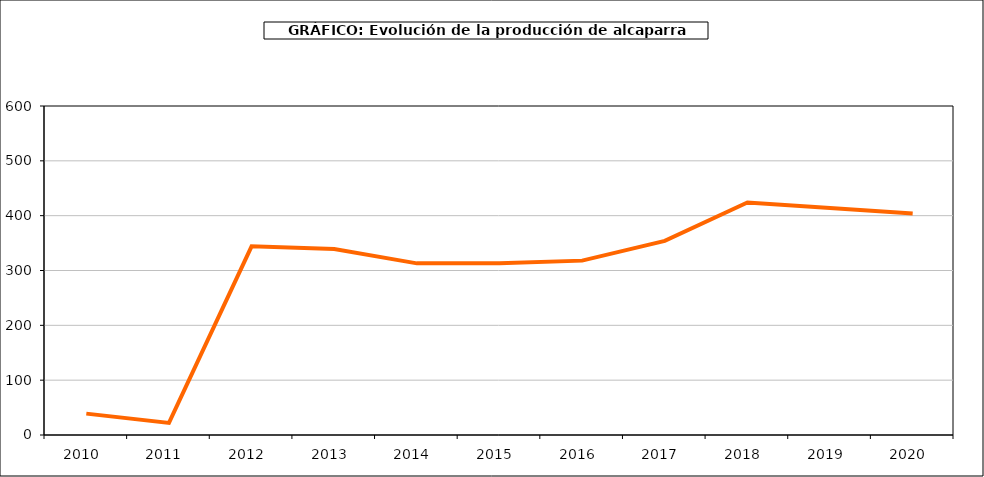
| Category | producción |
|---|---|
| 2010.0 | 39 |
| 2011.0 | 22 |
| 2012.0 | 344 |
| 2013.0 | 339 |
| 2014.0 | 313 |
| 2015.0 | 313 |
| 2016.0 | 318 |
| 2017.0 | 354 |
| 2018.0 | 424 |
| 2019.0 | 414 |
| 2020.0 | 404 |